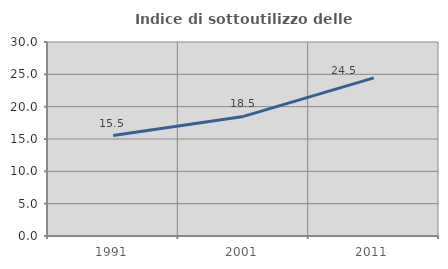
| Category | Indice di sottoutilizzo delle abitazioni  |
|---|---|
| 1991.0 | 15.532 |
| 2001.0 | 18.492 |
| 2011.0 | 24.454 |